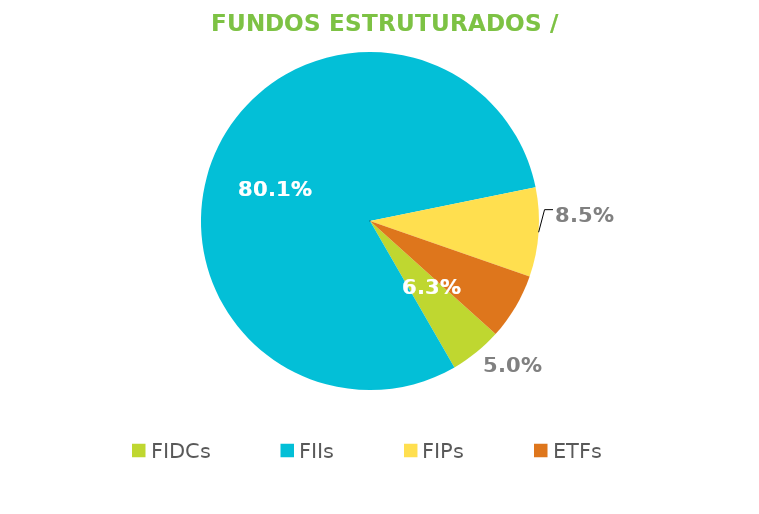
| Category | Fundos Estruturados / ETFs |
|---|---|
| FIDCs | 0.05 |
| FIIs | 0.801 |
| FIPs | 0.085 |
| ETFs | 0.063 |